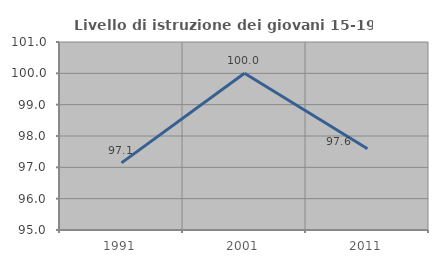
| Category | Livello di istruzione dei giovani 15-19 anni |
|---|---|
| 1991.0 | 97.143 |
| 2001.0 | 100 |
| 2011.0 | 97.59 |